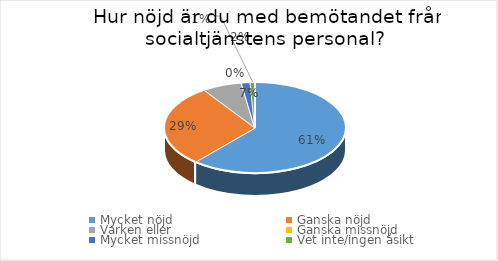
| Category | Series 0 |
|---|---|
| Mycket nöjd  | 78 |
| Ganska nöjd | 37 |
| Varken eller  | 9 |
| Ganska missnöjd | 0 |
| Mycket missnöjd  | 2 |
| Vet inte/ingen åsikt | 1 |